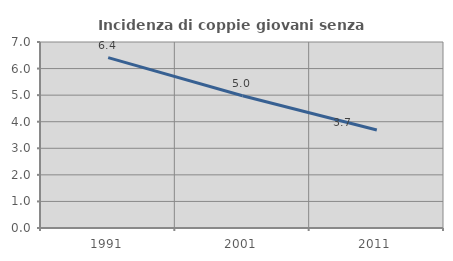
| Category | Incidenza di coppie giovani senza figli |
|---|---|
| 1991.0 | 6.41 |
| 2001.0 | 4.979 |
| 2011.0 | 3.689 |